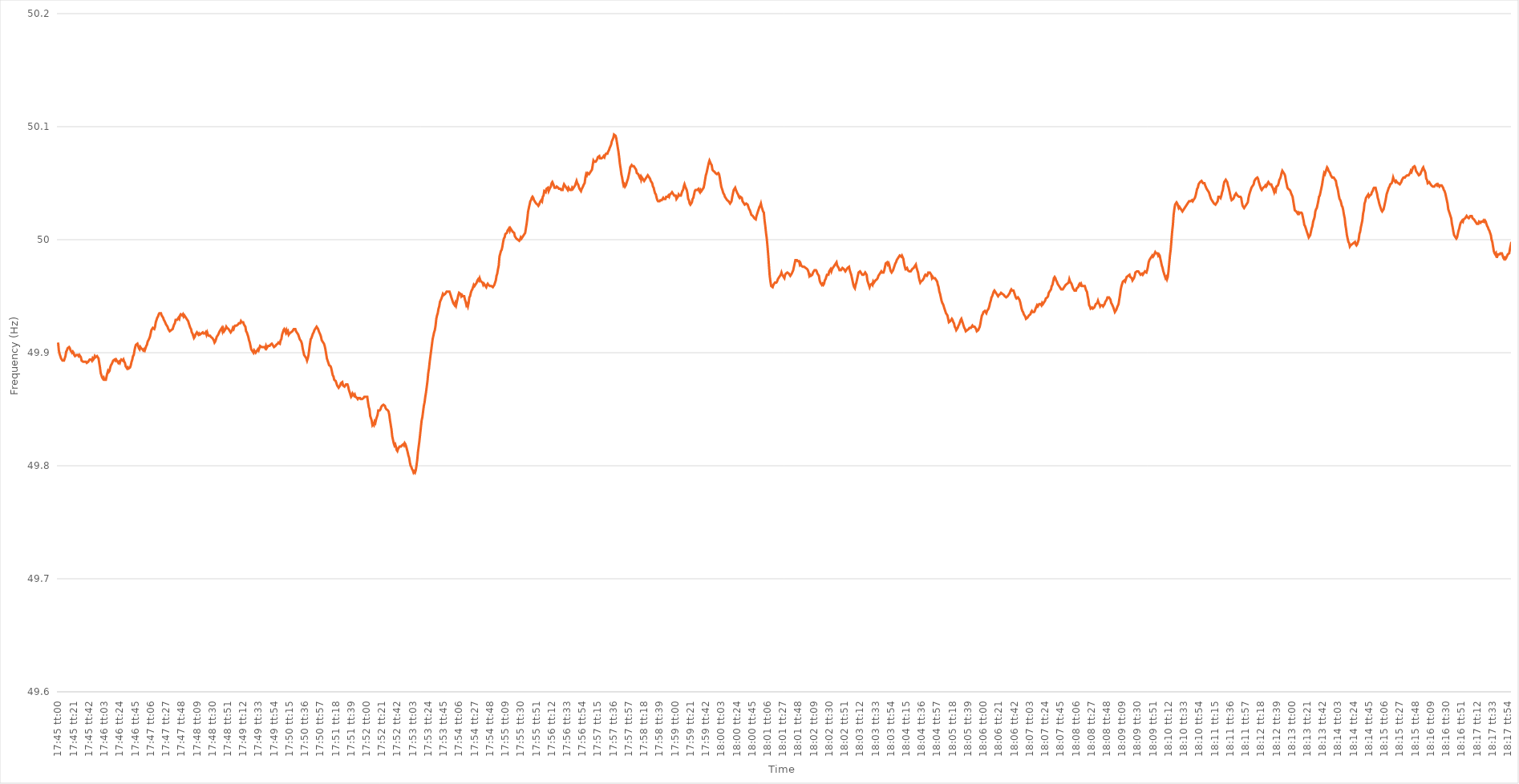
| Category | Series 0 |
|---|---|
| 0.7395833333333334 | 49.909 |
| 0.7395949074074074 | 49.902 |
| 0.7396064814814814 | 49.899 |
| 0.7396180555555555 | 49.897 |
| 0.7396296296296296 | 49.895 |
| 0.7396412037037038 | 49.894 |
| 0.7396527777777777 | 49.893 |
| 0.7396643518518519 | 49.893 |
| 0.7396759259259259 | 49.893 |
| 0.7396875 | 49.895 |
| 0.739699074074074 | 49.897 |
| 0.7397106481481481 | 49.901 |
| 0.7397222222222223 | 49.902 |
| 0.7397337962962963 | 49.904 |
| 0.7397453703703704 | 49.904 |
| 0.7397569444444444 | 49.905 |
| 0.7397685185185185 | 49.904 |
| 0.7397800925925927 | 49.902 |
| 0.7397916666666666 | 49.901 |
| 0.7398032407407408 | 49.9 |
| 0.7398148148148148 | 49.901 |
| 0.739826388888889 | 49.9 |
| 0.7398379629629629 | 49.898 |
| 0.739849537037037 | 49.897 |
| 0.7398611111111112 | 49.897 |
| 0.7398726851851851 | 49.898 |
| 0.7398842592592593 | 49.898 |
| 0.7398958333333333 | 49.898 |
| 0.7399074074074075 | 49.897 |
| 0.7399189814814814 | 49.898 |
| 0.7399305555555555 | 49.898 |
| 0.7399421296296297 | 49.896 |
| 0.7399537037037037 | 49.893 |
| 0.7399652777777778 | 49.893 |
| 0.7399768518518518 | 49.892 |
| 0.739988425925926 | 49.892 |
| 0.7400000000000001 | 49.892 |
| 0.740011574074074 | 49.892 |
| 0.7400231481481482 | 49.892 |
| 0.7400347222222222 | 49.891 |
| 0.7400462962962964 | 49.891 |
| 0.7400578703703703 | 49.892 |
| 0.7400694444444444 | 49.893 |
| 0.7400810185185186 | 49.894 |
| 0.7400925925925925 | 49.894 |
| 0.7401041666666667 | 49.894 |
| 0.7401157407407407 | 49.893 |
| 0.7401273148148149 | 49.895 |
| 0.7401388888888888 | 49.894 |
| 0.7401504629629629 | 49.895 |
| 0.7401620370370371 | 49.897 |
| 0.7401736111111111 | 49.896 |
| 0.7401851851851852 | 49.896 |
| 0.7401967592592592 | 49.897 |
| 0.7402083333333334 | 49.897 |
| 0.7402199074074075 | 49.895 |
| 0.7402314814814814 | 49.891 |
| 0.7402430555555556 | 49.887 |
| 0.7402546296296296 | 49.882 |
| 0.7402662037037038 | 49.88 |
| 0.7402777777777777 | 49.878 |
| 0.7402893518518519 | 49.877 |
| 0.740300925925926 | 49.878 |
| 0.7403124999999999 | 49.876 |
| 0.7403240740740741 | 49.876 |
| 0.7403356481481481 | 49.876 |
| 0.7403472222222223 | 49.879 |
| 0.7403587962962962 | 49.882 |
| 0.7403703703703703 | 49.884 |
| 0.7403819444444445 | 49.883 |
| 0.7403935185185185 | 49.884 |
| 0.7404050925925926 | 49.887 |
| 0.7404166666666666 | 49.889 |
| 0.7404282407407408 | 49.89 |
| 0.7404398148148149 | 49.89 |
| 0.7404513888888888 | 49.893 |
| 0.740462962962963 | 49.893 |
| 0.740474537037037 | 49.894 |
| 0.7404861111111112 | 49.893 |
| 0.7404976851851851 | 49.894 |
| 0.7405092592592593 | 49.893 |
| 0.7405208333333334 | 49.892 |
| 0.7405324074074073 | 49.891 |
| 0.7405439814814815 | 49.892 |
| 0.7405555555555555 | 49.891 |
| 0.7405671296296297 | 49.893 |
| 0.7405787037037036 | 49.894 |
| 0.7405902777777778 | 49.894 |
| 0.7406018518518519 | 49.893 |
| 0.7406134259259259 | 49.894 |
| 0.740625 | 49.892 |
| 0.740636574074074 | 49.891 |
| 0.7406481481481482 | 49.888 |
| 0.7406597222222223 | 49.887 |
| 0.7406712962962962 | 49.886 |
| 0.7406828703703704 | 49.887 |
| 0.7406944444444444 | 49.886 |
| 0.7407060185185186 | 49.886 |
| 0.7407175925925925 | 49.887 |
| 0.7407291666666667 | 49.889 |
| 0.7407407407407408 | 49.892 |
| 0.7407523148148147 | 49.894 |
| 0.7407638888888889 | 49.897 |
| 0.7407754629629629 | 49.898 |
| 0.7407870370370371 | 49.902 |
| 0.740798611111111 | 49.905 |
| 0.7408101851851852 | 49.907 |
| 0.7408217592592593 | 49.907 |
| 0.7408333333333333 | 49.908 |
| 0.7408449074074074 | 49.906 |
| 0.7408564814814814 | 49.904 |
| 0.7408680555555556 | 49.903 |
| 0.7408796296296297 | 49.905 |
| 0.7408912037037036 | 49.904 |
| 0.7409027777777778 | 49.904 |
| 0.7409143518518518 | 49.903 |
| 0.740925925925926 | 49.902 |
| 0.7409374999999999 | 49.903 |
| 0.7409490740740741 | 49.902 |
| 0.7409606481481482 | 49.904 |
| 0.7409722222222223 | 49.906 |
| 0.7409837962962963 | 49.907 |
| 0.7409953703703703 | 49.91 |
| 0.7410069444444445 | 49.911 |
| 0.7410185185185186 | 49.911 |
| 0.7410300925925926 | 49.914 |
| 0.7410416666666667 | 49.917 |
| 0.7410532407407407 | 49.92 |
| 0.7410648148148148 | 49.921 |
| 0.7410763888888888 | 49.922 |
| 0.741087962962963 | 49.922 |
| 0.7410995370370371 | 49.921 |
| 0.741111111111111 | 49.923 |
| 0.7411226851851852 | 49.927 |
| 0.7411342592592592 | 49.929 |
| 0.7411458333333334 | 49.931 |
| 0.7411574074074073 | 49.932 |
| 0.7411689814814815 | 49.934 |
| 0.7411805555555556 | 49.935 |
| 0.7411921296296297 | 49.935 |
| 0.7412037037037037 | 49.935 |
| 0.7412152777777777 | 49.933 |
| 0.7412268518518519 | 49.932 |
| 0.741238425925926 | 49.931 |
| 0.74125 | 49.929 |
| 0.7412615740740741 | 49.928 |
| 0.7412731481481482 | 49.928 |
| 0.7412847222222222 | 49.925 |
| 0.7412962962962962 | 49.925 |
| 0.7413078703703704 | 49.923 |
| 0.7413194444444445 | 49.921 |
| 0.7413310185185185 | 49.921 |
| 0.7413425925925926 | 49.919 |
| 0.7413541666666666 | 49.919 |
| 0.7413657407407408 | 49.92 |
| 0.7413773148148147 | 49.92 |
| 0.7413888888888889 | 49.921 |
| 0.741400462962963 | 49.923 |
| 0.7414120370370371 | 49.925 |
| 0.7414236111111111 | 49.926 |
| 0.7414351851851851 | 49.929 |
| 0.7414467592592593 | 49.929 |
| 0.7414583333333334 | 49.929 |
| 0.7414699074074074 | 49.93 |
| 0.7414814814814815 | 49.931 |
| 0.7414930555555556 | 49.93 |
| 0.7415046296296296 | 49.933 |
| 0.7415162037037036 | 49.934 |
| 0.7415277777777778 | 49.934 |
| 0.7415393518518519 | 49.933 |
| 0.7415509259259259 | 49.934 |
| 0.7415625 | 49.932 |
| 0.741574074074074 | 49.933 |
| 0.7415856481481482 | 49.932 |
| 0.7415972222222221 | 49.931 |
| 0.7416087962962963 | 49.93 |
| 0.7416203703703704 | 49.93 |
| 0.7416319444444445 | 49.928 |
| 0.7416435185185185 | 49.926 |
| 0.7416550925925925 | 49.924 |
| 0.7416666666666667 | 49.922 |
| 0.7416782407407408 | 49.921 |
| 0.7416898148148148 | 49.918 |
| 0.7417013888888889 | 49.917 |
| 0.741712962962963 | 49.915 |
| 0.741724537037037 | 49.913 |
| 0.741736111111111 | 49.914 |
| 0.7417476851851852 | 49.916 |
| 0.7417592592592593 | 49.916 |
| 0.7417708333333333 | 49.918 |
| 0.7417824074074074 | 49.917 |
| 0.7417939814814815 | 49.916 |
| 0.7418055555555556 | 49.917 |
| 0.7418171296296295 | 49.916 |
| 0.7418287037037037 | 49.916 |
| 0.7418402777777778 | 49.917 |
| 0.7418518518518519 | 49.917 |
| 0.7418634259259259 | 49.918 |
| 0.741875 | 49.917 |
| 0.7418865740740741 | 49.917 |
| 0.7418981481481483 | 49.917 |
| 0.7419097222222222 | 49.918 |
| 0.7419212962962963 | 49.916 |
| 0.7419328703703704 | 49.918 |
| 0.7419444444444444 | 49.916 |
| 0.7419560185185184 | 49.915 |
| 0.7419675925925926 | 49.915 |
| 0.7419791666666667 | 49.915 |
| 0.7419907407407407 | 49.914 |
| 0.7420023148148148 | 49.914 |
| 0.7420138888888889 | 49.913 |
| 0.742025462962963 | 49.912 |
| 0.7420370370370369 | 49.911 |
| 0.7420486111111111 | 49.909 |
| 0.7420601851851852 | 49.91 |
| 0.7420717592592593 | 49.912 |
| 0.7420833333333333 | 49.914 |
| 0.7420949074074074 | 49.914 |
| 0.7421064814814815 | 49.916 |
| 0.7421180555555557 | 49.916 |
| 0.7421296296296296 | 49.919 |
| 0.7421412037037037 | 49.92 |
| 0.7421527777777778 | 49.921 |
| 0.7421643518518519 | 49.922 |
| 0.7421759259259259 | 49.919 |
| 0.7421875 | 49.921 |
| 0.7421990740740741 | 49.919 |
| 0.7422106481481481 | 49.92 |
| 0.7422222222222222 | 49.921 |
| 0.7422337962962963 | 49.923 |
| 0.7422453703703704 | 49.922 |
| 0.7422569444444443 | 49.922 |
| 0.7422685185185185 | 49.921 |
| 0.7422800925925926 | 49.92 |
| 0.7422916666666667 | 49.92 |
| 0.7423032407407407 | 49.918 |
| 0.7423148148148148 | 49.919 |
| 0.7423263888888889 | 49.92 |
| 0.7423379629629631 | 49.922 |
| 0.742349537037037 | 49.921 |
| 0.7423611111111111 | 49.923 |
| 0.7423726851851852 | 49.924 |
| 0.7423842592592593 | 49.924 |
| 0.7423958333333333 | 49.924 |
| 0.7424074074074074 | 49.924 |
| 0.7424189814814816 | 49.925 |
| 0.7424305555555556 | 49.926 |
| 0.7424421296296296 | 49.926 |
| 0.7424537037037037 | 49.926 |
| 0.7424652777777778 | 49.928 |
| 0.7424768518518517 | 49.927 |
| 0.7424884259259259 | 49.927 |
| 0.7425 | 49.927 |
| 0.7425115740740741 | 49.925 |
| 0.7425231481481481 | 49.924 |
| 0.7425347222222222 | 49.923 |
| 0.7425462962962963 | 49.919 |
| 0.7425578703703705 | 49.918 |
| 0.7425694444444444 | 49.916 |
| 0.7425810185185185 | 49.914 |
| 0.7425925925925926 | 49.911 |
| 0.7426041666666667 | 49.909 |
| 0.7426157407407407 | 49.906 |
| 0.7426273148148148 | 49.903 |
| 0.742638888888889 | 49.903 |
| 0.742650462962963 | 49.901 |
| 0.742662037037037 | 49.9 |
| 0.7426736111111111 | 49.902 |
| 0.7426851851851852 | 49.901 |
| 0.7426967592592592 | 49.9 |
| 0.7427083333333333 | 49.9 |
| 0.7427199074074075 | 49.902 |
| 0.7427314814814815 | 49.903 |
| 0.7427430555555555 | 49.902 |
| 0.7427546296296296 | 49.904 |
| 0.7427662037037037 | 49.906 |
| 0.7427777777777779 | 49.906 |
| 0.7427893518518518 | 49.905 |
| 0.742800925925926 | 49.905 |
| 0.7428125 | 49.905 |
| 0.7428240740740741 | 49.905 |
| 0.7428356481481481 | 49.905 |
| 0.7428472222222222 | 49.904 |
| 0.7428587962962964 | 49.906 |
| 0.7428703703703704 | 49.904 |
| 0.7428819444444444 | 49.905 |
| 0.7428935185185185 | 49.906 |
| 0.7429050925925926 | 49.906 |
| 0.7429166666666666 | 49.906 |
| 0.7429282407407407 | 49.907 |
| 0.7429398148148149 | 49.907 |
| 0.7429513888888889 | 49.908 |
| 0.7429629629629629 | 49.907 |
| 0.742974537037037 | 49.906 |
| 0.7429861111111111 | 49.905 |
| 0.7429976851851853 | 49.905 |
| 0.7430092592592592 | 49.906 |
| 0.7430208333333334 | 49.907 |
| 0.7430324074074074 | 49.907 |
| 0.7430439814814815 | 49.908 |
| 0.7430555555555555 | 49.909 |
| 0.7430671296296296 | 49.909 |
| 0.7430787037037038 | 49.908 |
| 0.7430902777777778 | 49.911 |
| 0.7431018518518518 | 49.912 |
| 0.7431134259259259 | 49.916 |
| 0.743125 | 49.918 |
| 0.743136574074074 | 49.92 |
| 0.7431481481481481 | 49.921 |
| 0.7431597222222223 | 49.92 |
| 0.7431712962962963 | 49.918 |
| 0.7431828703703703 | 49.92 |
| 0.7431944444444444 | 49.918 |
| 0.7432060185185185 | 49.919 |
| 0.7432175925925927 | 49.916 |
| 0.7432291666666666 | 49.917 |
| 0.7432407407407408 | 49.917 |
| 0.7432523148148148 | 49.918 |
| 0.743263888888889 | 49.918 |
| 0.7432754629629629 | 49.919 |
| 0.743287037037037 | 49.919 |
| 0.7432986111111112 | 49.921 |
| 0.7433101851851852 | 49.921 |
| 0.7433217592592593 | 49.921 |
| 0.7433333333333333 | 49.919 |
| 0.7433449074074074 | 49.919 |
| 0.7433564814814814 | 49.917 |
| 0.7433680555555555 | 49.916 |
| 0.7433796296296297 | 49.914 |
| 0.7433912037037037 | 49.912 |
| 0.7434027777777777 | 49.912 |
| 0.7434143518518518 | 49.91 |
| 0.7434259259259259 | 49.908 |
| 0.7434375000000001 | 49.904 |
| 0.743449074074074 | 49.901 |
| 0.7434606481481482 | 49.898 |
| 0.7434722222222222 | 49.897 |
| 0.7434837962962964 | 49.896 |
| 0.7434953703703703 | 49.895 |
| 0.7435069444444444 | 49.893 |
| 0.7435185185185186 | 49.895 |
| 0.7435300925925926 | 49.898 |
| 0.7435416666666667 | 49.903 |
| 0.7435532407407407 | 49.908 |
| 0.7435648148148148 | 49.912 |
| 0.743576388888889 | 49.913 |
| 0.7435879629629629 | 49.915 |
| 0.7435995370370371 | 49.917 |
| 0.7436111111111111 | 49.918 |
| 0.7436226851851853 | 49.92 |
| 0.7436342592592592 | 49.921 |
| 0.7436458333333333 | 49.922 |
| 0.7436574074074075 | 49.923 |
| 0.7436689814814814 | 49.922 |
| 0.7436805555555556 | 49.921 |
| 0.7436921296296296 | 49.919 |
| 0.7437037037037038 | 49.919 |
| 0.7437152777777777 | 49.916 |
| 0.7437268518518518 | 49.914 |
| 0.743738425925926 | 49.911 |
| 0.74375 | 49.91 |
| 0.7437615740740741 | 49.909 |
| 0.7437731481481481 | 49.908 |
| 0.7437847222222222 | 49.906 |
| 0.7437962962962964 | 49.903 |
| 0.7438078703703703 | 49.899 |
| 0.7438194444444445 | 49.895 |
| 0.7438310185185185 | 49.893 |
| 0.7438425925925927 | 49.891 |
| 0.7438541666666666 | 49.889 |
| 0.7438657407407407 | 49.889 |
| 0.7438773148148149 | 49.888 |
| 0.7438888888888888 | 49.886 |
| 0.743900462962963 | 49.883 |
| 0.743912037037037 | 49.88 |
| 0.7439236111111112 | 49.879 |
| 0.7439351851851851 | 49.876 |
| 0.7439467592592592 | 49.876 |
| 0.7439583333333334 | 49.875 |
| 0.7439699074074074 | 49.875 |
| 0.7439814814814815 | 49.871 |
| 0.7439930555555555 | 49.87 |
| 0.7440046296296297 | 49.869 |
| 0.7440162037037038 | 49.869 |
| 0.7440277777777777 | 49.871 |
| 0.7440393518518519 | 49.873 |
| 0.7440509259259259 | 49.873 |
| 0.7440625000000001 | 49.874 |
| 0.744074074074074 | 49.871 |
| 0.7440856481481481 | 49.871 |
| 0.7440972222222223 | 49.87 |
| 0.7441087962962962 | 49.871 |
| 0.7441203703703704 | 49.872 |
| 0.7441319444444444 | 49.872 |
| 0.7441435185185186 | 49.872 |
| 0.7441550925925925 | 49.87 |
| 0.7441666666666666 | 49.867 |
| 0.7441782407407408 | 49.865 |
| 0.7441898148148148 | 49.863 |
| 0.7442013888888889 | 49.861 |
| 0.7442129629629629 | 49.862 |
| 0.7442245370370371 | 49.864 |
| 0.7442361111111112 | 49.864 |
| 0.7442476851851851 | 49.862 |
| 0.7442592592592593 | 49.863 |
| 0.7442708333333333 | 49.861 |
| 0.7442824074074075 | 49.861 |
| 0.7442939814814814 | 49.86 |
| 0.7443055555555556 | 49.859 |
| 0.7443171296296297 | 49.86 |
| 0.7443287037037036 | 49.86 |
| 0.7443402777777778 | 49.86 |
| 0.7443518518518518 | 49.859 |
| 0.744363425925926 | 49.859 |
| 0.7443749999999999 | 49.859 |
| 0.744386574074074 | 49.859 |
| 0.7443981481481482 | 49.86 |
| 0.7444097222222222 | 49.861 |
| 0.7444212962962963 | 49.861 |
| 0.7444328703703703 | 49.861 |
| 0.7444444444444445 | 49.861 |
| 0.7444560185185186 | 49.861 |
| 0.7444675925925925 | 49.856 |
| 0.7444791666666667 | 49.852 |
| 0.7444907407407407 | 49.85 |
| 0.7445023148148149 | 49.844 |
| 0.7445138888888888 | 49.842 |
| 0.744525462962963 | 49.84 |
| 0.7445370370370371 | 49.836 |
| 0.744548611111111 | 49.837 |
| 0.7445601851851852 | 49.836 |
| 0.7445717592592592 | 49.839 |
| 0.7445833333333334 | 49.838 |
| 0.7445949074074073 | 49.841 |
| 0.7446064814814815 | 49.843 |
| 0.7446180555555556 | 49.845 |
| 0.7446296296296296 | 49.849 |
| 0.7446412037037037 | 49.849 |
| 0.7446527777777777 | 49.849 |
| 0.7446643518518519 | 49.85 |
| 0.744675925925926 | 49.852 |
| 0.7446875 | 49.853 |
| 0.7446990740740741 | 49.853 |
| 0.7447106481481481 | 49.854 |
| 0.7447222222222223 | 49.854 |
| 0.7447337962962962 | 49.853 |
| 0.7447453703703704 | 49.851 |
| 0.7447569444444445 | 49.85 |
| 0.7447685185185186 | 49.85 |
| 0.7447800925925926 | 49.849 |
| 0.7447916666666666 | 49.848 |
| 0.7448032407407408 | 49.845 |
| 0.7448148148148147 | 49.84 |
| 0.7448263888888889 | 49.836 |
| 0.744837962962963 | 49.832 |
| 0.744849537037037 | 49.826 |
| 0.7448611111111111 | 49.823 |
| 0.7448726851851851 | 49.82 |
| 0.7448842592592593 | 49.818 |
| 0.7448958333333334 | 49.819 |
| 0.7449074074074074 | 49.817 |
| 0.7449189814814815 | 49.814 |
| 0.7449305555555555 | 49.813 |
| 0.7449421296296297 | 49.815 |
| 0.7449537037037036 | 49.815 |
| 0.7449652777777778 | 49.817 |
| 0.7449768518518519 | 49.817 |
| 0.744988425925926 | 49.817 |
| 0.745 | 49.818 |
| 0.745011574074074 | 49.818 |
| 0.7450231481481482 | 49.819 |
| 0.7450347222222223 | 49.818 |
| 0.7450462962962963 | 49.82 |
| 0.7450578703703704 | 49.819 |
| 0.7450694444444445 | 49.817 |
| 0.7450810185185185 | 49.817 |
| 0.7450925925925925 | 49.812 |
| 0.7451041666666667 | 49.809 |
| 0.7451157407407408 | 49.807 |
| 0.7451273148148148 | 49.803 |
| 0.7451388888888889 | 49.8 |
| 0.745150462962963 | 49.799 |
| 0.7451620370370371 | 49.797 |
| 0.745173611111111 | 49.796 |
| 0.7451851851851852 | 49.794 |
| 0.7451967592592593 | 49.795 |
| 0.7452083333333334 | 49.794 |
| 0.7452199074074074 | 49.796 |
| 0.7452314814814814 | 49.8 |
| 0.7452430555555556 | 49.805 |
| 0.7452546296296297 | 49.812 |
| 0.7452662037037037 | 49.817 |
| 0.7452777777777778 | 49.822 |
| 0.7452893518518519 | 49.828 |
| 0.7453009259259259 | 49.834 |
| 0.7453124999999999 | 49.84 |
| 0.7453240740740741 | 49.843 |
| 0.7453356481481482 | 49.848 |
| 0.7453472222222222 | 49.853 |
| 0.7453587962962963 | 49.856 |
| 0.7453703703703703 | 49.861 |
| 0.7453819444444445 | 49.865 |
| 0.7453935185185184 | 49.87 |
| 0.7454050925925926 | 49.875 |
| 0.7454166666666667 | 49.882 |
| 0.7454282407407408 | 49.886 |
| 0.7454398148148148 | 49.892 |
| 0.7454513888888888 | 49.897 |
| 0.745462962962963 | 49.902 |
| 0.7454745370370371 | 49.907 |
| 0.7454861111111111 | 49.912 |
| 0.7454976851851852 | 49.915 |
| 0.7455092592592593 | 49.918 |
| 0.7455208333333333 | 49.92 |
| 0.7455324074074073 | 49.924 |
| 0.7455439814814815 | 49.93 |
| 0.7455555555555556 | 49.933 |
| 0.7455671296296296 | 49.935 |
| 0.7455787037037037 | 49.939 |
| 0.7455902777777778 | 49.941 |
| 0.7456018518518519 | 49.945 |
| 0.7456134259259258 | 49.945 |
| 0.745625 | 49.948 |
| 0.7456365740740741 | 49.95 |
| 0.7456481481481482 | 49.952 |
| 0.7456597222222222 | 49.951 |
| 0.7456712962962962 | 49.951 |
| 0.7456828703703704 | 49.952 |
| 0.7456944444444445 | 49.953 |
| 0.7457060185185185 | 49.954 |
| 0.7457175925925926 | 49.954 |
| 0.7457291666666667 | 49.954 |
| 0.7457407407407407 | 49.954 |
| 0.7457523148148147 | 49.954 |
| 0.7457638888888889 | 49.952 |
| 0.745775462962963 | 49.952 |
| 0.745787037037037 | 49.948 |
| 0.7457986111111111 | 49.946 |
| 0.7458101851851852 | 49.944 |
| 0.7458217592592593 | 49.944 |
| 0.7458333333333332 | 49.942 |
| 0.7458449074074074 | 49.944 |
| 0.7458564814814815 | 49.942 |
| 0.7458680555555556 | 49.945 |
| 0.7458796296296296 | 49.948 |
| 0.7458912037037037 | 49.951 |
| 0.7459027777777778 | 49.953 |
| 0.745914351851852 | 49.953 |
| 0.7459259259259259 | 49.952 |
| 0.7459375 | 49.95 |
| 0.7459490740740741 | 49.951 |
| 0.7459606481481481 | 49.95 |
| 0.7459722222222221 | 49.95 |
| 0.7459837962962963 | 49.95 |
| 0.7459953703703704 | 49.947 |
| 0.7460069444444444 | 49.945 |
| 0.7460185185185185 | 49.942 |
| 0.7460300925925926 | 49.943 |
| 0.7460416666666667 | 49.941 |
| 0.7460532407407406 | 49.944 |
| 0.7460648148148148 | 49.949 |
| 0.7460763888888889 | 49.95 |
| 0.746087962962963 | 49.953 |
| 0.746099537037037 | 49.955 |
| 0.7461111111111111 | 49.956 |
| 0.7461226851851852 | 49.958 |
| 0.7461342592592594 | 49.96 |
| 0.7461458333333333 | 49.959 |
| 0.7461574074074074 | 49.96 |
| 0.7461689814814815 | 49.961 |
| 0.7461805555555556 | 49.962 |
| 0.7461921296296296 | 49.964 |
| 0.7462037037037037 | 49.965 |
| 0.7462152777777779 | 49.964 |
| 0.7462268518518519 | 49.966 |
| 0.7462384259259259 | 49.964 |
| 0.74625 | 49.963 |
| 0.7462615740740741 | 49.963 |
| 0.746273148148148 | 49.962 |
| 0.7462847222222222 | 49.96 |
| 0.7462962962962963 | 49.961 |
| 0.7463078703703704 | 49.96 |
| 0.7463194444444444 | 49.96 |
| 0.7463310185185185 | 49.958 |
| 0.7463425925925926 | 49.96 |
| 0.7463541666666668 | 49.961 |
| 0.7463657407407407 | 49.96 |
| 0.7463773148148148 | 49.96 |
| 0.7463888888888889 | 49.959 |
| 0.746400462962963 | 49.959 |
| 0.746412037037037 | 49.959 |
| 0.7464236111111111 | 49.959 |
| 0.7464351851851853 | 49.958 |
| 0.7464467592592593 | 49.959 |
| 0.7464583333333333 | 49.96 |
| 0.7464699074074074 | 49.962 |
| 0.7464814814814815 | 49.964 |
| 0.7464930555555555 | 49.968 |
| 0.7465046296296296 | 49.97 |
| 0.7465162037037038 | 49.974 |
| 0.7465277777777778 | 49.977 |
| 0.7465393518518518 | 49.985 |
| 0.7465509259259259 | 49.985 |
| 0.7465625 | 49.99 |
| 0.7465740740740742 | 49.991 |
| 0.7465856481481481 | 49.994 |
| 0.7465972222222222 | 49.998 |
| 0.7466087962962963 | 50.001 |
| 0.7466203703703704 | 50.002 |
| 0.7466319444444444 | 50.005 |
| 0.7466435185185185 | 50.005 |
| 0.7466550925925927 | 50.006 |
| 0.7466666666666667 | 50.008 |
| 0.7466782407407407 | 50.009 |
| 0.7466898148148148 | 50.01 |
| 0.7467013888888889 | 50.008 |
| 0.7467129629629629 | 50.01 |
| 0.746724537037037 | 50.01 |
| 0.7467361111111112 | 50.008 |
| 0.7467476851851852 | 50.007 |
| 0.7467592592592592 | 50.007 |
| 0.7467708333333333 | 50.006 |
| 0.7467824074074074 | 50.003 |
| 0.7467939814814816 | 50.003 |
| 0.7468055555555555 | 50.001 |
| 0.7468171296296297 | 50.001 |
| 0.7468287037037037 | 50 |
| 0.7468402777777778 | 50 |
| 0.7468518518518518 | 49.999 |
| 0.7468634259259259 | 50 |
| 0.7468750000000001 | 50.002 |
| 0.7468865740740741 | 50.001 |
| 0.7468981481481481 | 50.002 |
| 0.7469097222222222 | 50.002 |
| 0.7469212962962963 | 50.004 |
| 0.7469328703703703 | 50.004 |
| 0.7469444444444444 | 50.006 |
| 0.7469560185185186 | 50.01 |
| 0.7469675925925926 | 50.014 |
| 0.7469791666666666 | 50.019 |
| 0.7469907407407407 | 50.025 |
| 0.7470023148148148 | 50.028 |
| 0.747013888888889 | 50.031 |
| 0.7470254629629629 | 50.034 |
| 0.747037037037037 | 50.035 |
| 0.7470486111111111 | 50.037 |
| 0.7470601851851852 | 50.038 |
| 0.7470717592592592 | 50.037 |
| 0.7470833333333333 | 50.035 |
| 0.7470949074074075 | 50.034 |
| 0.7471064814814815 | 50.033 |
| 0.7471180555555555 | 50.032 |
| 0.7471296296296296 | 50.032 |
| 0.7471412037037037 | 50.031 |
| 0.7471527777777777 | 50.03 |
| 0.7471643518518518 | 50.031 |
| 0.747175925925926 | 50.033 |
| 0.7471875 | 50.033 |
| 0.747199074074074 | 50.035 |
| 0.7472106481481481 | 50.034 |
| 0.7472222222222222 | 50.038 |
| 0.7472337962962964 | 50.039 |
| 0.7472453703703703 | 50.043 |
| 0.7472569444444445 | 50.043 |
| 0.7472685185185185 | 50.042 |
| 0.7472800925925926 | 50.045 |
| 0.7472916666666666 | 50.045 |
| 0.7473032407407407 | 50.046 |
| 0.7473148148148149 | 50.043 |
| 0.7473263888888889 | 50.043 |
| 0.747337962962963 | 50.046 |
| 0.747349537037037 | 50.047 |
| 0.7473611111111111 | 50.05 |
| 0.7473726851851853 | 50.051 |
| 0.7473842592592592 | 50.051 |
| 0.7473958333333334 | 50.048 |
| 0.7474074074074074 | 50.046 |
| 0.7474189814814814 | 50.046 |
| 0.7474305555555555 | 50.046 |
| 0.7474421296296296 | 50.047 |
| 0.7474537037037038 | 50.047 |
| 0.7474652777777777 | 50.046 |
| 0.7474768518518519 | 50.045 |
| 0.7474884259259259 | 50.045 |
| 0.7475 | 50.045 |
| 0.747511574074074 | 50.044 |
| 0.7475231481481481 | 50.044 |
| 0.7475347222222223 | 50.044 |
| 0.7475462962962963 | 50.047 |
| 0.7475578703703704 | 50.049 |
| 0.7475694444444444 | 50.048 |
| 0.7475810185185185 | 50.048 |
| 0.7475925925925927 | 50.046 |
| 0.7476041666666666 | 50.045 |
| 0.7476157407407408 | 50.044 |
| 0.7476273148148148 | 50.046 |
| 0.747638888888889 | 50.045 |
| 0.7476504629629629 | 50.044 |
| 0.747662037037037 | 50.044 |
| 0.7476736111111112 | 50.044 |
| 0.7476851851851851 | 50.046 |
| 0.7476967592592593 | 50.045 |
| 0.7477083333333333 | 50.046 |
| 0.7477199074074075 | 50.046 |
| 0.7477314814814814 | 50.048 |
| 0.7477430555555555 | 50.05 |
| 0.7477546296296297 | 50.052 |
| 0.7477662037037037 | 50.05 |
| 0.7477777777777778 | 50.049 |
| 0.7477893518518518 | 50.047 |
| 0.747800925925926 | 50.045 |
| 0.7478125000000001 | 50.045 |
| 0.747824074074074 | 50.043 |
| 0.7478356481481482 | 50.045 |
| 0.7478472222222222 | 50.046 |
| 0.7478587962962964 | 50.046 |
| 0.7478703703703703 | 50.049 |
| 0.7478819444444444 | 50.05 |
| 0.7478935185185186 | 50.055 |
| 0.7479050925925925 | 50.058 |
| 0.7479166666666667 | 50.057 |
| 0.7479282407407407 | 50.059 |
| 0.7479398148148149 | 50.059 |
| 0.7479513888888888 | 50.058 |
| 0.7479629629629629 | 50.059 |
| 0.7479745370370371 | 50.059 |
| 0.7479861111111111 | 50.061 |
| 0.7479976851851852 | 50.062 |
| 0.7480092592592592 | 50.066 |
| 0.7480208333333334 | 50.07 |
| 0.7480324074074075 | 50.069 |
| 0.7480439814814814 | 50.069 |
| 0.7480555555555556 | 50.069 |
| 0.7480671296296296 | 50.07 |
| 0.7480787037037038 | 50.071 |
| 0.7480902777777777 | 50.073 |
| 0.7481018518518519 | 50.073 |
| 0.748113425925926 | 50.074 |
| 0.7481249999999999 | 50.072 |
| 0.7481365740740741 | 50.072 |
| 0.7481481481481481 | 50.072 |
| 0.7481597222222223 | 50.072 |
| 0.7481712962962962 | 50.073 |
| 0.7481828703703703 | 50.074 |
| 0.7481944444444445 | 50.073 |
| 0.7482060185185185 | 50.075 |
| 0.7482175925925926 | 50.076 |
| 0.7482291666666666 | 50.076 |
| 0.7482407407407408 | 50.076 |
| 0.7482523148148149 | 50.078 |
| 0.7482638888888888 | 50.079 |
| 0.748275462962963 | 50.081 |
| 0.748287037037037 | 50.081 |
| 0.7482986111111112 | 50.084 |
| 0.7483101851851851 | 50.087 |
| 0.7483217592592593 | 50.087 |
| 0.7483333333333334 | 50.09 |
| 0.7483449074074073 | 50.093 |
| 0.7483564814814815 | 50.093 |
| 0.7483680555555555 | 50.092 |
| 0.7483796296296297 | 50.09 |
| 0.7483912037037036 | 50.086 |
| 0.7484027777777778 | 50.082 |
| 0.7484143518518519 | 50.078 |
| 0.7484259259259259 | 50.073 |
| 0.7484375 | 50.067 |
| 0.748449074074074 | 50.063 |
| 0.7484606481481482 | 50.058 |
| 0.7484722222222223 | 50.055 |
| 0.7484837962962962 | 50.051 |
| 0.7484953703703704 | 50.048 |
| 0.7485069444444444 | 50.049 |
| 0.7485185185185186 | 50.047 |
| 0.7485300925925925 | 50.048 |
| 0.7485416666666667 | 50.05 |
| 0.7485532407407408 | 50.052 |
| 0.7485648148148147 | 50.054 |
| 0.7485763888888889 | 50.057 |
| 0.7485879629629629 | 50.06 |
| 0.7485995370370371 | 50.064 |
| 0.748611111111111 | 50.064 |
| 0.7486226851851852 | 50.066 |
| 0.7486342592592593 | 50.065 |
| 0.7486458333333333 | 50.065 |
| 0.7486574074074074 | 50.065 |
| 0.7486689814814814 | 50.064 |
| 0.7486805555555556 | 50.063 |
| 0.7486921296296297 | 50.062 |
| 0.7487037037037036 | 50.059 |
| 0.7487152777777778 | 50.059 |
| 0.7487268518518518 | 50.058 |
| 0.748738425925926 | 50.058 |
| 0.7487499999999999 | 50.055 |
| 0.7487615740740741 | 50.056 |
| 0.7487731481481482 | 50.053 |
| 0.7487847222222223 | 50.055 |
| 0.7487962962962963 | 50.054 |
| 0.7488078703703703 | 50.053 |
| 0.7488194444444445 | 50.052 |
| 0.7488310185185186 | 50.053 |
| 0.7488425925925926 | 50.053 |
| 0.7488541666666667 | 50.055 |
| 0.7488657407407407 | 50.056 |
| 0.7488773148148148 | 50.057 |
| 0.7488888888888888 | 50.056 |
| 0.748900462962963 | 50.056 |
| 0.7489120370370371 | 50.054 |
| 0.748923611111111 | 50.052 |
| 0.7489351851851852 | 50.051 |
| 0.7489467592592592 | 50.05 |
| 0.7489583333333334 | 50.047 |
| 0.7489699074074073 | 50.046 |
| 0.7489814814814815 | 50.043 |
| 0.7489930555555556 | 50.041 |
| 0.7490046296296297 | 50.04 |
| 0.7490162037037037 | 50.037 |
| 0.7490277777777777 | 50.035 |
| 0.7490393518518519 | 50.034 |
| 0.749050925925926 | 50.034 |
| 0.7490625 | 50.034 |
| 0.7490740740740741 | 50.035 |
| 0.7490856481481482 | 50.035 |
| 0.7490972222222222 | 50.035 |
| 0.7491087962962962 | 50.036 |
| 0.7491203703703704 | 50.037 |
| 0.7491319444444445 | 50.036 |
| 0.7491435185185185 | 50.036 |
| 0.7491550925925926 | 50.036 |
| 0.7491666666666666 | 50.038 |
| 0.7491782407407408 | 50.038 |
| 0.7491898148148147 | 50.038 |
| 0.7492013888888889 | 50.039 |
| 0.749212962962963 | 50.038 |
| 0.7492245370370371 | 50.04 |
| 0.7492361111111111 | 50.04 |
| 0.7492476851851851 | 50.041 |
| 0.7492592592592593 | 50.042 |
| 0.7492708333333334 | 50.042 |
| 0.7492824074074074 | 50.04 |
| 0.7492939814814815 | 50.039 |
| 0.7493055555555556 | 50.039 |
| 0.7493171296296296 | 50.039 |
| 0.7493287037037036 | 50.036 |
| 0.7493402777777778 | 50.037 |
| 0.7493518518518519 | 50.038 |
| 0.7493634259259259 | 50.04 |
| 0.749375 | 50.039 |
| 0.749386574074074 | 50.039 |
| 0.7493981481481482 | 50.039 |
| 0.7494097222222221 | 50.041 |
| 0.7494212962962963 | 50.043 |
| 0.7494328703703704 | 50.044 |
| 0.7494444444444445 | 50.047 |
| 0.7494560185185185 | 50.049 |
| 0.7494675925925925 | 50.047 |
| 0.7494791666666667 | 50.047 |
| 0.7494907407407408 | 50.044 |
| 0.7495023148148148 | 50.041 |
| 0.7495138888888889 | 50.036 |
| 0.749525462962963 | 50.035 |
| 0.749537037037037 | 50.032 |
| 0.749548611111111 | 50.031 |
| 0.7495601851851852 | 50.032 |
| 0.7495717592592593 | 50.033 |
| 0.7495833333333333 | 50.036 |
| 0.7495949074074074 | 50.037 |
| 0.7496064814814815 | 50.04 |
| 0.7496180555555556 | 50.043 |
| 0.7496296296296295 | 50.044 |
| 0.7496412037037037 | 50.044 |
| 0.7496527777777778 | 50.044 |
| 0.7496643518518519 | 50.044 |
| 0.7496759259259259 | 50.045 |
| 0.7496875 | 50.043 |
| 0.7496990740740741 | 50.042 |
| 0.7497106481481483 | 50.044 |
| 0.7497222222222222 | 50.043 |
| 0.7497337962962963 | 50.043 |
| 0.7497453703703704 | 50.045 |
| 0.7497569444444444 | 50.046 |
| 0.7497685185185184 | 50.049 |
| 0.7497800925925926 | 50.053 |
| 0.7497916666666667 | 50.057 |
| 0.7498032407407407 | 50.059 |
| 0.7498148148148148 | 50.062 |
| 0.7498263888888889 | 50.065 |
| 0.749837962962963 | 50.068 |
| 0.7498495370370369 | 50.07 |
| 0.7498611111111111 | 50.07 |
| 0.7498726851851852 | 50.067 |
| 0.7498842592592593 | 50.066 |
| 0.7498958333333333 | 50.062 |
| 0.7499074074074074 | 50.061 |
| 0.7499189814814815 | 50.061 |
| 0.7499305555555557 | 50.06 |
| 0.7499421296296296 | 50.059 |
| 0.7499537037037037 | 50.059 |
| 0.7499652777777778 | 50.058 |
| 0.7499768518518519 | 50.058 |
| 0.7499884259259259 | 50.059 |
| 0.75 | 50.058 |
| 0.7500115740740741 | 50.055 |
| 0.7500231481481481 | 50.051 |
| 0.7500347222222222 | 50.047 |
| 0.7500462962962963 | 50.045 |
| 0.7500578703703704 | 50.043 |
| 0.7500694444444443 | 50.041 |
| 0.7500810185185185 | 50.04 |
| 0.7500925925925926 | 50.038 |
| 0.7501041666666667 | 50.038 |
| 0.7501157407407407 | 50.036 |
| 0.7501273148148148 | 50.035 |
| 0.7501388888888889 | 50.035 |
| 0.7501504629629631 | 50.034 |
| 0.750162037037037 | 50.034 |
| 0.7501736111111111 | 50.032 |
| 0.7501851851851852 | 50.033 |
| 0.7501967592592593 | 50.034 |
| 0.7502083333333333 | 50.038 |
| 0.7502199074074074 | 50.041 |
| 0.7502314814814816 | 50.044 |
| 0.7502430555555555 | 50.044 |
| 0.7502546296296296 | 50.046 |
| 0.7502662037037037 | 50.044 |
| 0.7502777777777778 | 50.044 |
| 0.7502893518518517 | 50.041 |
| 0.7503009259259259 | 50.04 |
| 0.7503125 | 50.038 |
| 0.7503240740740741 | 50.037 |
| 0.7503356481481481 | 50.038 |
| 0.7503472222222222 | 50.038 |
| 0.7503587962962963 | 50.037 |
| 0.7503703703703705 | 50.034 |
| 0.7503819444444444 | 50.033 |
| 0.7503935185185185 | 50.032 |
| 0.7504050925925926 | 50.031 |
| 0.7504166666666667 | 50.031 |
| 0.7504282407407407 | 50.032 |
| 0.7504398148148148 | 50.032 |
| 0.750451388888889 | 50.031 |
| 0.750462962962963 | 50.031 |
| 0.750474537037037 | 50.027 |
| 0.7504861111111111 | 50.026 |
| 0.7504976851851852 | 50.024 |
| 0.7505092592592592 | 50.022 |
| 0.7505208333333333 | 50.022 |
| 0.7505324074074075 | 50.021 |
| 0.7505439814814815 | 50.02 |
| 0.7505555555555555 | 50.019 |
| 0.7505671296296296 | 50.019 |
| 0.7505787037037037 | 50.018 |
| 0.7505902777777779 | 50.021 |
| 0.7506018518518518 | 50.021 |
| 0.750613425925926 | 50.025 |
| 0.750625 | 50.027 |
| 0.7506365740740741 | 50.029 |
| 0.7506481481481481 | 50.03 |
| 0.7506597222222222 | 50.032 |
| 0.7506712962962964 | 50.029 |
| 0.7506828703703704 | 50.027 |
| 0.7506944444444444 | 50.025 |
| 0.7507060185185185 | 50.024 |
| 0.7507175925925926 | 50.017 |
| 0.7507291666666666 | 50.012 |
| 0.7507407407407407 | 50.006 |
| 0.7507523148148149 | 50.001 |
| 0.7507638888888889 | 49.994 |
| 0.7507754629629629 | 49.986 |
| 0.750787037037037 | 49.977 |
| 0.7507986111111111 | 49.968 |
| 0.7508101851851853 | 49.963 |
| 0.7508217592592592 | 49.959 |
| 0.7508333333333334 | 49.959 |
| 0.7508449074074074 | 49.958 |
| 0.7508564814814815 | 49.96 |
| 0.7508680555555555 | 49.961 |
| 0.7508796296296296 | 49.962 |
| 0.7508912037037038 | 49.962 |
| 0.7509027777777778 | 49.962 |
| 0.7509143518518518 | 49.963 |
| 0.7509259259259259 | 49.965 |
| 0.7509375 | 49.966 |
| 0.750949074074074 | 49.966 |
| 0.7509606481481481 | 49.968 |
| 0.7509722222222223 | 49.969 |
| 0.7509837962962963 | 49.971 |
| 0.7509953703703703 | 49.969 |
| 0.7510069444444444 | 49.968 |
| 0.7510185185185185 | 49.967 |
| 0.7510300925925927 | 49.966 |
| 0.7510416666666666 | 49.969 |
| 0.7510532407407408 | 49.97 |
| 0.7510648148148148 | 49.97 |
| 0.751076388888889 | 49.971 |
| 0.7510879629629629 | 49.971 |
| 0.751099537037037 | 49.97 |
| 0.7511111111111112 | 49.97 |
| 0.7511226851851852 | 49.968 |
| 0.7511342592592593 | 49.968 |
| 0.7511458333333333 | 49.97 |
| 0.7511574074074074 | 49.97 |
| 0.7511689814814816 | 49.973 |
| 0.7511805555555555 | 49.976 |
| 0.7511921296296297 | 49.979 |
| 0.7512037037037037 | 49.982 |
| 0.7512152777777777 | 49.982 |
| 0.7512268518518518 | 49.982 |
| 0.7512384259259259 | 49.981 |
| 0.7512500000000001 | 49.981 |
| 0.751261574074074 | 49.981 |
| 0.7512731481481482 | 49.978 |
| 0.7512847222222222 | 49.979 |
| 0.7512962962962964 | 49.977 |
| 0.7513078703703703 | 49.977 |
| 0.7513194444444444 | 49.976 |
| 0.7513310185185186 | 49.976 |
| 0.7513425925925926 | 49.976 |
| 0.7513541666666667 | 49.976 |
| 0.7513657407407407 | 49.975 |
| 0.7513773148148148 | 49.975 |
| 0.751388888888889 | 49.974 |
| 0.7514004629629629 | 49.973 |
| 0.7514120370370371 | 49.971 |
| 0.7514236111111111 | 49.968 |
| 0.7514351851851852 | 49.969 |
| 0.7514467592592592 | 49.968 |
| 0.7514583333333333 | 49.968 |
| 0.7514699074074075 | 49.969 |
| 0.7514814814814814 | 49.971 |
| 0.7514930555555556 | 49.972 |
| 0.7515046296296296 | 49.973 |
| 0.7515162037037038 | 49.973 |
| 0.7515277777777777 | 49.973 |
| 0.7515393518518518 | 49.972 |
| 0.751550925925926 | 49.97 |
| 0.7515625 | 49.97 |
| 0.7515740740740741 | 49.968 |
| 0.7515856481481481 | 49.964 |
| 0.7515972222222222 | 49.962 |
| 0.7516087962962964 | 49.961 |
| 0.7516203703703703 | 49.96 |
| 0.7516319444444445 | 49.961 |
| 0.7516435185185185 | 49.96 |
| 0.7516550925925927 | 49.961 |
| 0.7516666666666666 | 49.964 |
| 0.7516782407407407 | 49.965 |
| 0.7516898148148149 | 49.967 |
| 0.7517013888888888 | 49.969 |
| 0.751712962962963 | 49.969 |
| 0.751724537037037 | 49.969 |
| 0.7517361111111112 | 49.972 |
| 0.7517476851851851 | 49.973 |
| 0.7517592592592592 | 49.974 |
| 0.7517708333333334 | 49.972 |
| 0.7517824074074074 | 49.974 |
| 0.7517939814814815 | 49.974 |
| 0.7518055555555555 | 49.976 |
| 0.7518171296296297 | 49.976 |
| 0.7518287037037038 | 49.978 |
| 0.7518402777777777 | 49.979 |
| 0.7518518518518519 | 49.98 |
| 0.7518634259259259 | 49.977 |
| 0.7518750000000001 | 49.976 |
| 0.751886574074074 | 49.975 |
| 0.7518981481481481 | 49.973 |
| 0.7519097222222223 | 49.973 |
| 0.7519212962962962 | 49.973 |
| 0.7519328703703704 | 49.973 |
| 0.7519444444444444 | 49.975 |
| 0.7519560185185186 | 49.975 |
| 0.7519675925925925 | 49.974 |
| 0.7519791666666666 | 49.973 |
| 0.7519907407407408 | 49.972 |
| 0.7520023148148148 | 49.972 |
| 0.7520138888888889 | 49.974 |
| 0.7520254629629629 | 49.975 |
| 0.7520370370370371 | 49.975 |
| 0.7520486111111112 | 49.976 |
| 0.7520601851851851 | 49.973 |
| 0.7520717592592593 | 49.971 |
| 0.7520833333333333 | 49.969 |
| 0.7520949074074075 | 49.966 |
| 0.7521064814814814 | 49.963 |
| 0.7521180555555556 | 49.96 |
| 0.7521296296296297 | 49.958 |
| 0.7521412037037036 | 49.957 |
| 0.7521527777777778 | 49.96 |
| 0.7521643518518518 | 49.962 |
| 0.752175925925926 | 49.965 |
| 0.7521874999999999 | 49.968 |
| 0.752199074074074 | 49.971 |
| 0.7522106481481482 | 49.971 |
| 0.7522222222222222 | 49.972 |
| 0.7522337962962963 | 49.971 |
| 0.7522453703703703 | 49.97 |
| 0.7522569444444445 | 49.969 |
| 0.7522685185185186 | 49.969 |
| 0.7522800925925925 | 49.969 |
| 0.7522916666666667 | 49.97 |
| 0.7523032407407407 | 49.971 |
| 0.7523148148148149 | 49.97 |
| 0.7523263888888888 | 49.969 |
| 0.752337962962963 | 49.964 |
| 0.7523495370370371 | 49.962 |
| 0.7523611111111111 | 49.96 |
| 0.7523726851851852 | 49.958 |
| 0.7523842592592592 | 49.96 |
| 0.7523958333333334 | 49.96 |
| 0.7524074074074073 | 49.961 |
| 0.7524189814814815 | 49.96 |
| 0.7524305555555556 | 49.963 |
| 0.7524421296296296 | 49.962 |
| 0.7524537037037037 | 49.963 |
| 0.7524652777777777 | 49.964 |
| 0.7524768518518519 | 49.964 |
| 0.752488425925926 | 49.965 |
| 0.7525 | 49.966 |
| 0.7525115740740741 | 49.968 |
| 0.7525231481481481 | 49.969 |
| 0.7525347222222223 | 49.97 |
| 0.7525462962962962 | 49.971 |
| 0.7525578703703704 | 49.972 |
| 0.7525694444444445 | 49.971 |
| 0.7525810185185186 | 49.971 |
| 0.7525925925925926 | 49.971 |
| 0.7526041666666666 | 49.973 |
| 0.7526157407407408 | 49.976 |
| 0.7526273148148147 | 49.979 |
| 0.7526388888888889 | 49.979 |
| 0.752650462962963 | 49.98 |
| 0.752662037037037 | 49.978 |
| 0.7526736111111111 | 49.979 |
| 0.7526851851851851 | 49.977 |
| 0.7526967592592593 | 49.974 |
| 0.7527083333333334 | 49.972 |
| 0.7527199074074074 | 49.971 |
| 0.7527314814814815 | 49.971 |
| 0.7527430555555555 | 49.973 |
| 0.7527546296296297 | 49.973 |
| 0.7527662037037036 | 49.977 |
| 0.7527777777777778 | 49.979 |
| 0.7527893518518519 | 49.98 |
| 0.752800925925926 | 49.982 |
| 0.7528125 | 49.983 |
| 0.752824074074074 | 49.983 |
| 0.7528356481481482 | 49.985 |
| 0.7528472222222221 | 49.986 |
| 0.7528587962962963 | 49.986 |
| 0.7528703703703704 | 49.985 |
| 0.7528819444444445 | 49.986 |
| 0.7528935185185185 | 49.986 |
| 0.7529050925925925 | 49.983 |
| 0.7529166666666667 | 49.979 |
| 0.7529282407407408 | 49.976 |
| 0.7529398148148148 | 49.974 |
| 0.7529513888888889 | 49.974 |
| 0.752962962962963 | 49.975 |
| 0.7529745370370371 | 49.973 |
| 0.752986111111111 | 49.973 |
| 0.7529976851851852 | 49.972 |
| 0.7530092592592593 | 49.972 |
| 0.7530208333333334 | 49.972 |
| 0.7530324074074074 | 49.973 |
| 0.7530439814814814 | 49.974 |
| 0.7530555555555556 | 49.974 |
| 0.7530671296296297 | 49.975 |
| 0.7530787037037037 | 49.976 |
| 0.7530902777777778 | 49.977 |
| 0.7531018518518519 | 49.978 |
| 0.7531134259259259 | 49.975 |
| 0.7531249999999999 | 49.973 |
| 0.7531365740740741 | 49.971 |
| 0.7531481481481482 | 49.967 |
| 0.7531597222222222 | 49.964 |
| 0.7531712962962963 | 49.962 |
| 0.7531828703703703 | 49.963 |
| 0.7531944444444445 | 49.963 |
| 0.7532060185185184 | 49.964 |
| 0.7532175925925926 | 49.965 |
| 0.7532291666666667 | 49.966 |
| 0.7532407407407408 | 49.968 |
| 0.7532523148148148 | 49.969 |
| 0.7532638888888888 | 49.969 |
| 0.753275462962963 | 49.968 |
| 0.7532870370370371 | 49.969 |
| 0.7532986111111111 | 49.971 |
| 0.7533101851851852 | 49.971 |
| 0.7533217592592593 | 49.971 |
| 0.7533333333333333 | 49.97 |
| 0.7533449074074073 | 49.969 |
| 0.7533564814814815 | 49.966 |
| 0.7533680555555556 | 49.967 |
| 0.7533796296296296 | 49.966 |
| 0.7533912037037037 | 49.966 |
| 0.7534027777777778 | 49.966 |
| 0.7534143518518519 | 49.965 |
| 0.7534259259259258 | 49.964 |
| 0.7534375 | 49.963 |
| 0.7534490740740741 | 49.96 |
| 0.7534606481481482 | 49.958 |
| 0.7534722222222222 | 49.954 |
| 0.7534837962962962 | 49.952 |
| 0.7534953703703704 | 49.949 |
| 0.7535069444444445 | 49.946 |
| 0.7535185185185185 | 49.944 |
| 0.7535300925925926 | 49.943 |
| 0.7535416666666667 | 49.941 |
| 0.7535532407407407 | 49.939 |
| 0.7535648148148147 | 49.937 |
| 0.7535763888888889 | 49.935 |
| 0.753587962962963 | 49.934 |
| 0.753599537037037 | 49.933 |
| 0.7536111111111111 | 49.93 |
| 0.7536226851851852 | 49.927 |
| 0.7536342592592593 | 49.927 |
| 0.7536458333333332 | 49.928 |
| 0.7536574074074074 | 49.929 |
| 0.7536689814814815 | 49.93 |
| 0.7536805555555556 | 49.929 |
| 0.7536921296296296 | 49.927 |
| 0.7537037037037037 | 49.926 |
| 0.7537152777777778 | 49.923 |
| 0.753726851851852 | 49.922 |
| 0.7537384259259259 | 49.92 |
| 0.75375 | 49.921 |
| 0.7537615740740741 | 49.922 |
| 0.7537731481481482 | 49.924 |
| 0.7537847222222221 | 49.925 |
| 0.7537962962962963 | 49.927 |
| 0.7538078703703704 | 49.929 |
| 0.7538194444444444 | 49.93 |
| 0.7538310185185185 | 49.928 |
| 0.7538425925925926 | 49.926 |
| 0.7538541666666667 | 49.924 |
| 0.7538657407407406 | 49.922 |
| 0.7538773148148148 | 49.921 |
| 0.7538888888888889 | 49.919 |
| 0.753900462962963 | 49.919 |
| 0.753912037037037 | 49.92 |
| 0.7539236111111111 | 49.92 |
| 0.7539351851851852 | 49.921 |
| 0.7539467592592594 | 49.922 |
| 0.7539583333333333 | 49.922 |
| 0.7539699074074074 | 49.922 |
| 0.7539814814814815 | 49.923 |
| 0.7539930555555556 | 49.924 |
| 0.7540046296296296 | 49.923 |
| 0.7540162037037037 | 49.923 |
| 0.7540277777777779 | 49.923 |
| 0.7540393518518518 | 49.922 |
| 0.7540509259259259 | 49.921 |
| 0.7540625 | 49.919 |
| 0.7540740740740741 | 49.919 |
| 0.754085648148148 | 49.92 |
| 0.7540972222222222 | 49.92 |
| 0.7541087962962963 | 49.923 |
| 0.7541203703703704 | 49.926 |
| 0.7541319444444444 | 49.93 |
| 0.7541435185185185 | 49.933 |
| 0.7541550925925926 | 49.934 |
| 0.7541666666666668 | 49.936 |
| 0.7541782407407407 | 49.936 |
| 0.7541898148148148 | 49.937 |
| 0.7542013888888889 | 49.936 |
| 0.754212962962963 | 49.935 |
| 0.754224537037037 | 49.937 |
| 0.7542361111111111 | 49.938 |
| 0.7542476851851853 | 49.939 |
| 0.7542592592592593 | 49.941 |
| 0.7542708333333333 | 49.944 |
| 0.7542824074074074 | 49.946 |
| 0.7542939814814815 | 49.949 |
| 0.7543055555555555 | 49.95 |
| 0.7543171296296296 | 49.952 |
| 0.7543287037037038 | 49.954 |
| 0.7543402777777778 | 49.955 |
| 0.7543518518518518 | 49.954 |
| 0.7543634259259259 | 49.953 |
| 0.754375 | 49.952 |
| 0.7543865740740742 | 49.952 |
| 0.7543981481481481 | 49.95 |
| 0.7544097222222222 | 49.951 |
| 0.7544212962962963 | 49.951 |
| 0.7544328703703704 | 49.952 |
| 0.7544444444444444 | 49.953 |
| 0.7544560185185185 | 49.953 |
| 0.7544675925925927 | 49.952 |
| 0.7544791666666667 | 49.952 |
| 0.7544907407407407 | 49.951 |
| 0.7545023148148148 | 49.95 |
| 0.7545138888888889 | 49.95 |
| 0.7545254629629629 | 49.949 |
| 0.754537037037037 | 49.949 |
| 0.7545486111111112 | 49.95 |
| 0.7545601851851852 | 49.951 |
| 0.7545717592592592 | 49.951 |
| 0.7545833333333333 | 49.953 |
| 0.7545949074074074 | 49.955 |
| 0.7546064814814816 | 49.956 |
| 0.7546180555555555 | 49.955 |
| 0.7546296296296297 | 49.955 |
| 0.7546412037037037 | 49.955 |
| 0.7546527777777778 | 49.953 |
| 0.7546643518518518 | 49.951 |
| 0.7546759259259259 | 49.949 |
| 0.7546875000000001 | 49.948 |
| 0.7546990740740741 | 49.948 |
| 0.7547106481481481 | 49.949 |
| 0.7547222222222222 | 49.948 |
| 0.7547337962962963 | 49.947 |
| 0.7547453703703703 | 49.945 |
| 0.7547569444444444 | 49.942 |
| 0.7547685185185186 | 49.939 |
| 0.7547800925925926 | 49.937 |
| 0.7547916666666666 | 49.936 |
| 0.7548032407407407 | 49.934 |
| 0.7548148148148148 | 49.933 |
| 0.754826388888889 | 49.932 |
| 0.7548379629629629 | 49.93 |
| 0.754849537037037 | 49.93 |
| 0.7548611111111111 | 49.931 |
| 0.7548726851851852 | 49.931 |
| 0.7548842592592592 | 49.933 |
| 0.7548958333333333 | 49.933 |
| 0.7549074074074075 | 49.934 |
| 0.7549189814814815 | 49.936 |
| 0.7549305555555555 | 49.937 |
| 0.7549421296296296 | 49.936 |
| 0.7549537037037037 | 49.936 |
| 0.7549652777777779 | 49.936 |
| 0.7549768518518518 | 49.937 |
| 0.754988425925926 | 49.939 |
| 0.755 | 49.939 |
| 0.755011574074074 | 49.942 |
| 0.7550231481481481 | 49.941 |
| 0.7550347222222222 | 49.941 |
| 0.7550462962962964 | 49.943 |
| 0.7550578703703703 | 49.943 |
| 0.7550694444444445 | 49.943 |
| 0.7550810185185185 | 49.942 |
| 0.7550925925925926 | 49.944 |
| 0.7551041666666666 | 49.943 |
| 0.7551157407407407 | 49.944 |
| 0.7551273148148149 | 49.945 |
| 0.7551388888888889 | 49.946 |
| 0.755150462962963 | 49.948 |
| 0.755162037037037 | 49.948 |
| 0.7551736111111111 | 49.949 |
| 0.7551851851851853 | 49.95 |
| 0.7551967592592592 | 49.953 |
| 0.7552083333333334 | 49.953 |
| 0.7552199074074074 | 49.955 |
| 0.7552314814814814 | 49.956 |
| 0.7552430555555555 | 49.959 |
| 0.7552546296296296 | 49.96 |
| 0.7552662037037038 | 49.963 |
| 0.7552777777777777 | 49.966 |
| 0.7552893518518519 | 49.967 |
| 0.7553009259259259 | 49.966 |
| 0.7553125 | 49.964 |
| 0.755324074074074 | 49.963 |
| 0.7553356481481481 | 49.961 |
| 0.7553472222222223 | 49.96 |
| 0.7553587962962963 | 49.959 |
| 0.7553703703703704 | 49.959 |
| 0.7553819444444444 | 49.957 |
| 0.7553935185185185 | 49.956 |
| 0.7554050925925927 | 49.956 |
| 0.7554166666666666 | 49.956 |
| 0.7554282407407408 | 49.957 |
| 0.7554398148148148 | 49.957 |
| 0.7554513888888889 | 49.959 |
| 0.7554629629629629 | 49.96 |
| 0.755474537037037 | 49.96 |
| 0.7554861111111112 | 49.961 |
| 0.7554976851851851 | 49.961 |
| 0.7555092592592593 | 49.962 |
| 0.7555208333333333 | 49.965 |
| 0.7555324074074075 | 49.963 |
| 0.7555439814814814 | 49.963 |
| 0.7555555555555555 | 49.961 |
| 0.7555671296296297 | 49.959 |
| 0.7555787037037037 | 49.957 |
| 0.7555902777777778 | 49.957 |
| 0.7556018518518518 | 49.955 |
| 0.755613425925926 | 49.955 |
| 0.7556250000000001 | 49.955 |
| 0.755636574074074 | 49.957 |
| 0.7556481481481482 | 49.957 |
| 0.7556597222222222 | 49.958 |
| 0.7556712962962964 | 49.96 |
| 0.7556828703703703 | 49.961 |
| 0.7556944444444444 | 49.96 |
| 0.7557060185185186 | 49.961 |
| 0.7557175925925925 | 49.959 |
| 0.7557291666666667 | 49.959 |
| 0.7557407407407407 | 49.959 |
| 0.7557523148148149 | 49.959 |
| 0.7557638888888888 | 49.959 |
| 0.7557754629629629 | 49.957 |
| 0.7557870370370371 | 49.955 |
| 0.7557986111111111 | 49.954 |
| 0.7558101851851852 | 49.95 |
| 0.7558217592592592 | 49.947 |
| 0.7558333333333334 | 49.942 |
| 0.7558449074074075 | 49.941 |
| 0.7558564814814814 | 49.939 |
| 0.7558680555555556 | 49.939 |
| 0.7558796296296296 | 49.94 |
| 0.7558912037037038 | 49.939 |
| 0.7559027777777777 | 49.939 |
| 0.7559143518518519 | 49.94 |
| 0.755925925925926 | 49.94 |
| 0.7559374999999999 | 49.943 |
| 0.7559490740740741 | 49.943 |
| 0.7559606481481481 | 49.944 |
| 0.7559722222222223 | 49.946 |
| 0.7559837962962962 | 49.944 |
| 0.7559953703703703 | 49.943 |
| 0.7560069444444445 | 49.941 |
| 0.7560185185185185 | 49.942 |
| 0.7560300925925926 | 49.942 |
| 0.7560416666666666 | 49.942 |
| 0.7560532407407408 | 49.941 |
| 0.7560648148148149 | 49.942 |
| 0.7560763888888888 | 49.943 |
| 0.756087962962963 | 49.945 |
| 0.756099537037037 | 49.946 |
| 0.7561111111111112 | 49.947 |
| 0.7561226851851851 | 49.949 |
| 0.7561342592592593 | 49.949 |
| 0.7561458333333334 | 49.949 |
| 0.7561574074074073 | 49.949 |
| 0.7561689814814815 | 49.947 |
| 0.7561805555555555 | 49.944 |
| 0.7561921296296297 | 49.943 |
| 0.7562037037037036 | 49.943 |
| 0.7562152777777778 | 49.94 |
| 0.7562268518518519 | 49.938 |
| 0.7562384259259259 | 49.936 |
| 0.75625 | 49.936 |
| 0.756261574074074 | 49.938 |
| 0.7562731481481482 | 49.94 |
| 0.7562847222222223 | 49.94 |
| 0.7562962962962962 | 49.943 |
| 0.7563078703703704 | 49.947 |
| 0.7563194444444444 | 49.951 |
| 0.7563310185185186 | 49.956 |
| 0.7563425925925925 | 49.959 |
| 0.7563541666666667 | 49.961 |
| 0.7563657407407408 | 49.963 |
| 0.7563773148148148 | 49.963 |
| 0.7563888888888889 | 49.964 |
| 0.7564004629629629 | 49.963 |
| 0.7564120370370371 | 49.965 |
| 0.756423611111111 | 49.967 |
| 0.7564351851851852 | 49.967 |
| 0.7564467592592593 | 49.968 |
| 0.7564583333333333 | 49.968 |
| 0.7564699074074074 | 49.969 |
| 0.7564814814814814 | 49.967 |
| 0.7564930555555556 | 49.967 |
| 0.7565046296296297 | 49.966 |
| 0.7565162037037036 | 49.964 |
| 0.7565277777777778 | 49.964 |
| 0.7565393518518518 | 49.966 |
| 0.756550925925926 | 49.968 |
| 0.7565624999999999 | 49.971 |
| 0.7565740740740741 | 49.971 |
| 0.7565856481481482 | 49.972 |
| 0.7565972222222223 | 49.972 |
| 0.7566087962962963 | 49.972 |
| 0.7566203703703703 | 49.971 |
| 0.7566319444444445 | 49.97 |
| 0.7566435185185184 | 49.969 |
| 0.7566550925925926 | 49.969 |
| 0.7566666666666667 | 49.97 |
| 0.7566782407407407 | 49.969 |
| 0.7566898148148148 | 49.97 |
| 0.7567013888888888 | 49.971 |
| 0.756712962962963 | 49.972 |
| 0.7567245370370371 | 49.972 |
| 0.756736111111111 | 49.971 |
| 0.7567476851851852 | 49.973 |
| 0.7567592592592592 | 49.976 |
| 0.7567708333333334 | 49.98 |
| 0.7567824074074073 | 49.982 |
| 0.7567939814814815 | 49.983 |
| 0.7568055555555556 | 49.983 |
| 0.7568171296296297 | 49.985 |
| 0.7568287037037037 | 49.986 |
| 0.7568402777777777 | 49.985 |
| 0.7568518518518519 | 49.986 |
| 0.756863425925926 | 49.986 |
| 0.756875 | 49.989 |
| 0.7568865740740741 | 49.988 |
| 0.7568981481481482 | 49.988 |
| 0.7569097222222222 | 49.988 |
| 0.7569212962962962 | 49.986 |
| 0.7569328703703704 | 49.987 |
| 0.7569444444444445 | 49.986 |
| 0.7569560185185185 | 49.983 |
| 0.7569675925925926 | 49.98 |
| 0.7569791666666666 | 49.977 |
| 0.7569907407407408 | 49.975 |
| 0.7570023148148147 | 49.972 |
| 0.7570138888888889 | 49.97 |
| 0.757025462962963 | 49.968 |
| 0.7570370370370371 | 49.966 |
| 0.7570486111111111 | 49.967 |
| 0.7570601851851851 | 49.965 |
| 0.7570717592592593 | 49.967 |
| 0.7570833333333334 | 49.972 |
| 0.7570949074074074 | 49.979 |
| 0.7571064814814815 | 49.986 |
| 0.7571180555555556 | 49.991 |
| 0.7571296296296296 | 49.999 |
| 0.7571412037037036 | 50.007 |
| 0.7571527777777778 | 50.013 |
| 0.7571643518518519 | 50.022 |
| 0.7571759259259259 | 50.027 |
| 0.7571875 | 50.031 |
| 0.757199074074074 | 50.032 |
| 0.7572106481481482 | 50.033 |
| 0.7572222222222221 | 50.032 |
| 0.7572337962962963 | 50.03 |
| 0.7572453703703704 | 50.028 |
| 0.7572569444444445 | 50.029 |
| 0.7572685185185185 | 50.028 |
| 0.7572800925925925 | 50.028 |
| 0.7572916666666667 | 50.026 |
| 0.7573032407407408 | 50.025 |
| 0.7573148148148148 | 50.025 |
| 0.7573263888888889 | 50.027 |
| 0.757337962962963 | 50.027 |
| 0.757349537037037 | 50.029 |
| 0.757361111111111 | 50.029 |
| 0.7573726851851852 | 50.031 |
| 0.7573842592592593 | 50.032 |
| 0.7573958333333333 | 50.033 |
| 0.7574074074074074 | 50.034 |
| 0.7574189814814815 | 50.034 |
| 0.7574305555555556 | 50.034 |
| 0.7574421296296295 | 50.034 |
| 0.7574537037037037 | 50.035 |
| 0.7574652777777778 | 50.034 |
| 0.7574768518518519 | 50.035 |
| 0.7574884259259259 | 50.035 |
| 0.7575 | 50.037 |
| 0.7575115740740741 | 50.039 |
| 0.7575231481481483 | 50.042 |
| 0.7575347222222222 | 50.045 |
| 0.7575462962962963 | 50.046 |
| 0.7575578703703704 | 50.049 |
| 0.7575694444444445 | 50.05 |
| 0.7575810185185184 | 50.051 |
| 0.7575925925925926 | 50.051 |
| 0.7576041666666667 | 50.052 |
| 0.7576157407407407 | 50.051 |
| 0.7576273148148148 | 50.05 |
| 0.7576388888888889 | 50.05 |
| 0.757650462962963 | 50.05 |
| 0.7576620370370369 | 50.048 |
| 0.7576736111111111 | 50.048 |
| 0.7576851851851852 | 50.045 |
| 0.7576967592592593 | 50.044 |
| 0.7577083333333333 | 50.043 |
| 0.7577199074074074 | 50.042 |
| 0.7577314814814815 | 50.04 |
| 0.7577430555555557 | 50.038 |
| 0.7577546296296296 | 50.036 |
| 0.7577662037037037 | 50.035 |
| 0.7577777777777778 | 50.035 |
| 0.7577893518518519 | 50.033 |
| 0.7578009259259259 | 50.032 |
| 0.7578125 | 50.032 |
| 0.7578240740740741 | 50.031 |
| 0.7578356481481481 | 50.032 |
| 0.7578472222222222 | 50.033 |
| 0.7578587962962963 | 50.034 |
| 0.7578703703703704 | 50.038 |
| 0.7578819444444443 | 50.038 |
| 0.7578935185185185 | 50.038 |
| 0.7579050925925926 | 50.037 |
| 0.7579166666666667 | 50.039 |
| 0.7579282407407407 | 50.042 |
| 0.7579398148148148 | 50.044 |
| 0.7579513888888889 | 50.048 |
| 0.7579629629629631 | 50.051 |
| 0.757974537037037 | 50.052 |
| 0.7579861111111111 | 50.053 |
| 0.7579976851851852 | 50.052 |
| 0.7580092592592593 | 50.051 |
| 0.7580208333333333 | 50.048 |
| 0.7580324074074074 | 50.046 |
| 0.7580439814814816 | 50.043 |
| 0.7580555555555555 | 50.04 |
| 0.7580671296296296 | 50.037 |
| 0.7580787037037037 | 50.035 |
| 0.7580902777777778 | 50.035 |
| 0.7581018518518517 | 50.036 |
| 0.7581134259259259 | 50.037 |
| 0.758125 | 50.039 |
| 0.7581365740740741 | 50.04 |
| 0.7581481481481481 | 50.041 |
| 0.7581597222222222 | 50.04 |
| 0.7581712962962963 | 50.039 |
| 0.7581828703703705 | 50.039 |
| 0.7581944444444444 | 50.038 |
| 0.7582060185185185 | 50.038 |
| 0.7582175925925926 | 50.038 |
| 0.7582291666666667 | 50.037 |
| 0.7582407407407407 | 50.033 |
| 0.7582523148148148 | 50.03 |
| 0.758263888888889 | 50.029 |
| 0.758275462962963 | 50.028 |
| 0.758287037037037 | 50.029 |
| 0.7582986111111111 | 50.03 |
| 0.7583101851851852 | 50.031 |
| 0.7583217592592592 | 50.032 |
| 0.7583333333333333 | 50.033 |
| 0.7583449074074075 | 50.037 |
| 0.7583564814814815 | 50.04 |
| 0.7583680555555555 | 50.042 |
| 0.7583796296296296 | 50.044 |
| 0.7583912037037037 | 50.046 |
| 0.7584027777777779 | 50.046 |
| 0.7584143518518518 | 50.048 |
| 0.758425925925926 | 50.049 |
| 0.7584375 | 50.052 |
| 0.7584490740740741 | 50.053 |
| 0.7584606481481481 | 50.054 |
| 0.7584722222222222 | 50.054 |
| 0.7584837962962964 | 50.055 |
| 0.7584953703703704 | 50.054 |
| 0.7585069444444444 | 50.051 |
| 0.7585185185185185 | 50.049 |
| 0.7585300925925926 | 50.047 |
| 0.7585416666666666 | 50.045 |
| 0.7585532407407407 | 50.044 |
| 0.7585648148148149 | 50.045 |
| 0.7585763888888889 | 50.046 |
| 0.7585879629629629 | 50.046 |
| 0.758599537037037 | 50.047 |
| 0.7586111111111111 | 50.048 |
| 0.7586226851851853 | 50.047 |
| 0.7586342592592592 | 50.048 |
| 0.7586458333333334 | 50.05 |
| 0.7586574074074074 | 50.051 |
| 0.7586689814814815 | 50.05 |
| 0.7586805555555555 | 50.049 |
| 0.7586921296296296 | 50.049 |
| 0.7587037037037038 | 50.049 |
| 0.7587152777777778 | 50.047 |
| 0.7587268518518518 | 50.046 |
| 0.7587384259259259 | 50.044 |
| 0.75875 | 50.042 |
| 0.758761574074074 | 50.044 |
| 0.7587731481481481 | 50.043 |
| 0.7587847222222223 | 50.047 |
| 0.7587962962962963 | 50.047 |
| 0.7588078703703703 | 50.048 |
| 0.7588194444444444 | 50.05 |
| 0.7588310185185185 | 50.053 |
| 0.7588425925925927 | 50.054 |
| 0.7588541666666666 | 50.056 |
| 0.7588657407407408 | 50.059 |
| 0.7588773148148148 | 50.061 |
| 0.758888888888889 | 50.06 |
| 0.7589004629629629 | 50.06 |
| 0.758912037037037 | 50.058 |
| 0.7589236111111112 | 50.056 |
| 0.7589351851851852 | 50.052 |
| 0.7589467592592593 | 50.049 |
| 0.7589583333333333 | 50.046 |
| 0.7589699074074074 | 50.045 |
| 0.7589814814814816 | 50.045 |
| 0.7589930555555555 | 50.044 |
| 0.7590046296296297 | 50.043 |
| 0.7590162037037037 | 50.041 |
| 0.7590277777777777 | 50.041 |
| 0.7590393518518518 | 50.038 |
| 0.7590509259259259 | 50.034 |
| 0.7590625000000001 | 50.03 |
| 0.759074074074074 | 50.026 |
| 0.7590856481481482 | 50.026 |
| 0.7590972222222222 | 50.025 |
| 0.7591087962962964 | 50.025 |
| 0.7591203703703703 | 50.023 |
| 0.7591319444444444 | 50.024 |
| 0.7591435185185186 | 50.023 |
| 0.7591550925925926 | 50.024 |
| 0.7591666666666667 | 50.024 |
| 0.7591782407407407 | 50.024 |
| 0.7591898148148148 | 50.023 |
| 0.759201388888889 | 50.02 |
| 0.7592129629629629 | 50.017 |
| 0.7592245370370371 | 50.013 |
| 0.7592361111111111 | 50.012 |
| 0.7592476851851852 | 50.01 |
| 0.7592592592592592 | 50.01 |
| 0.7592708333333333 | 50.006 |
| 0.7592824074074075 | 50.004 |
| 0.7592939814814814 | 50.002 |
| 0.7593055555555556 | 50.002 |
| 0.7593171296296296 | 50.004 |
| 0.7593287037037038 | 50.007 |
| 0.7593402777777777 | 50.01 |
| 0.7593518518518518 | 50.012 |
| 0.759363425925926 | 50.016 |
| 0.759375 | 50.018 |
| 0.7593865740740741 | 50.02 |
| 0.7593981481481481 | 50.025 |
| 0.7594097222222222 | 50.027 |
| 0.7594212962962964 | 50.028 |
| 0.7594328703703703 | 50.031 |
| 0.7594444444444445 | 50.034 |
| 0.7594560185185185 | 50.038 |
| 0.7594675925925927 | 50.039 |
| 0.7594791666666666 | 50.042 |
| 0.7594907407407407 | 50.045 |
| 0.7595023148148149 | 50.048 |
| 0.7595138888888888 | 50.052 |
| 0.759525462962963 | 50.056 |
| 0.759537037037037 | 50.059 |
| 0.7595486111111112 | 50.058 |
| 0.7595601851851851 | 50.06 |
| 0.7595717592592592 | 50.062 |
| 0.7595833333333334 | 50.064 |
| 0.7595949074074074 | 50.063 |
| 0.7596064814814815 | 50.061 |
| 0.7596180555555555 | 50.061 |
| 0.7596296296296297 | 50.059 |
| 0.7596412037037038 | 50.057 |
| 0.7596527777777777 | 50.056 |
| 0.7596643518518519 | 50.055 |
| 0.7596759259259259 | 50.055 |
| 0.7596875000000001 | 50.055 |
| 0.759699074074074 | 50.055 |
| 0.7597106481481481 | 50.053 |
| 0.7597222222222223 | 50.052 |
| 0.7597337962962962 | 50.048 |
| 0.7597453703703704 | 50.046 |
| 0.7597569444444444 | 50.043 |
| 0.7597685185185186 | 50.039 |
| 0.7597800925925925 | 50.036 |
| 0.7597916666666666 | 50.035 |
| 0.7598032407407408 | 50.033 |
| 0.7598148148148148 | 50.03 |
| 0.7598263888888889 | 50.029 |
| 0.7598379629629629 | 50.026 |
| 0.7598495370370371 | 50.022 |
| 0.7598611111111112 | 50.019 |
| 0.7598726851851851 | 50.013 |
| 0.7598842592592593 | 50.009 |
| 0.7598958333333333 | 50.004 |
| 0.7599074074074075 | 50.001 |
| 0.7599189814814814 | 49.998 |
| 0.7599305555555556 | 49.997 |
| 0.7599421296296297 | 49.994 |
| 0.7599537037037036 | 49.995 |
| 0.7599652777777778 | 49.995 |
| 0.7599768518518518 | 49.996 |
| 0.759988425925926 | 49.996 |
| 0.7599999999999999 | 49.997 |
| 0.760011574074074 | 49.997 |
| 0.7600231481481482 | 49.998 |
| 0.7600347222222222 | 49.996 |
| 0.7600462962962963 | 49.995 |
| 0.7600578703703703 | 49.996 |
| 0.7600694444444445 | 49.998 |
| 0.7600810185185186 | 50 |
| 0.7600925925925925 | 50.005 |
| 0.7601041666666667 | 50.007 |
| 0.7601157407407407 | 50.011 |
| 0.7601273148148149 | 50.014 |
| 0.7601388888888888 | 50.017 |
| 0.760150462962963 | 50.023 |
| 0.7601620370370371 | 50.026 |
| 0.7601736111111111 | 50.032 |
| 0.7601851851851852 | 50.034 |
| 0.7601967592592592 | 50.037 |
| 0.7602083333333334 | 50.038 |
| 0.7602199074074073 | 50.038 |
| 0.7602314814814815 | 50.04 |
| 0.7602430555555556 | 50.038 |
| 0.7602546296296296 | 50.039 |
| 0.7602662037037037 | 50.039 |
| 0.7602777777777777 | 50.04 |
| 0.7602893518518519 | 50.042 |
| 0.760300925925926 | 50.043 |
| 0.7603125 | 50.045 |
| 0.7603240740740741 | 50.046 |
| 0.7603356481481481 | 50.046 |
| 0.7603472222222223 | 50.046 |
| 0.7603587962962962 | 50.043 |
| 0.7603703703703704 | 50.041 |
| 0.7603819444444445 | 50.037 |
| 0.7603935185185186 | 50.035 |
| 0.7604050925925926 | 50.032 |
| 0.7604166666666666 | 50.03 |
| 0.7604282407407408 | 50.028 |
| 0.7604398148148147 | 50.026 |
| 0.7604513888888889 | 50.025 |
| 0.760462962962963 | 50.025 |
| 0.760474537037037 | 50.027 |
| 0.7604861111111111 | 50.03 |
| 0.7604976851851851 | 50.033 |
| 0.7605092592592593 | 50.036 |
| 0.7605208333333334 | 50.04 |
| 0.7605324074074074 | 50.042 |
| 0.7605439814814815 | 50.044 |
| 0.7605555555555555 | 50.046 |
| 0.7605671296296297 | 50.047 |
| 0.7605787037037036 | 50.049 |
| 0.7605902777777778 | 50.049 |
| 0.7606018518518519 | 50.05 |
| 0.760613425925926 | 50.052 |
| 0.760625 | 50.055 |
| 0.760636574074074 | 50.053 |
| 0.7606481481481482 | 50.053 |
| 0.7606597222222221 | 50.051 |
| 0.7606712962962963 | 50.052 |
| 0.7606828703703704 | 50.051 |
| 0.7606944444444445 | 50.051 |
| 0.7607060185185185 | 50.05 |
| 0.7607175925925925 | 50.05 |
| 0.7607291666666667 | 50.049 |
| 0.7607407407407408 | 50.05 |
| 0.7607523148148148 | 50.051 |
| 0.7607638888888889 | 50.053 |
| 0.760775462962963 | 50.053 |
| 0.7607870370370371 | 50.055 |
| 0.760798611111111 | 50.055 |
| 0.7608101851851852 | 50.055 |
| 0.7608217592592593 | 50.056 |
| 0.7608333333333334 | 50.056 |
| 0.7608449074074074 | 50.057 |
| 0.7608564814814814 | 50.057 |
| 0.7608680555555556 | 50.057 |
| 0.7608796296296297 | 50.058 |
| 0.7608912037037037 | 50.059 |
| 0.7609027777777778 | 50.061 |
| 0.7609143518518519 | 50.06 |
| 0.7609259259259259 | 50.062 |
| 0.7609374999999999 | 50.064 |
| 0.7609490740740741 | 50.064 |
| 0.7609606481481482 | 50.065 |
| 0.7609722222222222 | 50.064 |
| 0.7609837962962963 | 50.061 |
| 0.7609953703703703 | 50.06 |
| 0.7610069444444445 | 50.059 |
| 0.7610185185185184 | 50.058 |
| 0.7610300925925926 | 50.057 |
| 0.7610416666666667 | 50.057 |
| 0.7610532407407408 | 50.058 |
| 0.7610648148148148 | 50.06 |
| 0.7610763888888888 | 50.061 |
| 0.761087962962963 | 50.063 |
| 0.7610995370370371 | 50.064 |
| 0.7611111111111111 | 50.062 |
| 0.7611226851851852 | 50.061 |
| 0.7611342592592593 | 50.059 |
| 0.7611458333333333 | 50.054 |
| 0.7611574074074073 | 50.053 |
| 0.7611689814814815 | 50.05 |
| 0.7611805555555556 | 50.05 |
| 0.7611921296296296 | 50.051 |
| 0.7612037037037037 | 50.051 |
| 0.7612152777777778 | 50.049 |
| 0.7612268518518519 | 50.048 |
| 0.7612384259259258 | 50.048 |
| 0.76125 | 50.047 |
| 0.7612615740740741 | 50.047 |
| 0.7612731481481482 | 50.047 |
| 0.7612847222222222 | 50.048 |
| 0.7612962962962962 | 50.048 |
| 0.7613078703703704 | 50.049 |
| 0.7613194444444445 | 50.048 |
| 0.7613310185185185 | 50.049 |
| 0.7613425925925926 | 50.048 |
| 0.7613541666666667 | 50.047 |
| 0.7613657407407407 | 50.048 |
| 0.7613773148148147 | 50.048 |
| 0.7613888888888889 | 50.048 |
| 0.761400462962963 | 50.047 |
| 0.761412037037037 | 50.046 |
| 0.7614236111111111 | 50.044 |
| 0.7614351851851852 | 50.043 |
| 0.7614467592592593 | 50.041 |
| 0.7614583333333332 | 50.038 |
| 0.7614699074074074 | 50.035 |
| 0.7614814814814815 | 50.032 |
| 0.7614930555555556 | 50.027 |
| 0.7615046296296296 | 50.025 |
| 0.7615162037037037 | 50.023 |
| 0.7615277777777778 | 50.021 |
| 0.761539351851852 | 50.019 |
| 0.7615509259259259 | 50.014 |
| 0.7615625 | 50.011 |
| 0.7615740740740741 | 50.007 |
| 0.7615856481481482 | 50.004 |
| 0.7615972222222221 | 50.003 |
| 0.7616087962962963 | 50.002 |
| 0.7616203703703704 | 50.001 |
| 0.7616319444444444 | 50.002 |
| 0.7616435185185185 | 50.005 |
| 0.7616550925925926 | 50.008 |
| 0.7616666666666667 | 50.01 |
| 0.7616782407407406 | 50.013 |
| 0.7616898148148148 | 50.015 |
| 0.7617013888888889 | 50.015 |
| 0.761712962962963 | 50.017 |
| 0.761724537037037 | 50.016 |
| 0.7617361111111111 | 50.018 |
| 0.7617476851851852 | 50.018 |
| 0.7617592592592594 | 50.019 |
| 0.7617708333333333 | 50.019 |
| 0.7617824074074074 | 50.021 |
| 0.7617939814814815 | 50.02 |
| 0.7618055555555556 | 50.02 |
| 0.7618171296296296 | 50.019 |
| 0.7618287037037037 | 50.019 |
| 0.7618402777777779 | 50.021 |
| 0.7618518518518518 | 50.021 |
| 0.7618634259259259 | 50.021 |
| 0.761875 | 50.019 |
| 0.7618865740740741 | 50.019 |
| 0.761898148148148 | 50.018 |
| 0.7619097222222222 | 50.018 |
| 0.7619212962962963 | 50.016 |
| 0.7619328703703704 | 50.015 |
| 0.7619444444444444 | 50.014 |
| 0.7619560185185185 | 50.014 |
| 0.7619675925925926 | 50.014 |
| 0.7619791666666668 | 50.016 |
| 0.7619907407407407 | 50.016 |
| 0.7620023148148148 | 50.015 |
| 0.7620138888888889 | 50.016 |
| 0.762025462962963 | 50.016 |
| 0.762037037037037 | 50.016 |
| 0.7620486111111111 | 50.017 |
| 0.7620601851851853 | 50.016 |
| 0.7620717592592593 | 50.017 |
| 0.7620833333333333 | 50.016 |
| 0.7620949074074074 | 50.014 |
| 0.7621064814814815 | 50.012 |
| 0.7621180555555555 | 50.011 |
| 0.7621296296296296 | 50.009 |
| 0.7621412037037038 | 50.008 |
| 0.7621527777777778 | 50.006 |
| 0.7621643518518518 | 50.004 |
| 0.7621759259259259 | 50 |
| 0.7621875 | 49.998 |
| 0.7621990740740742 | 49.994 |
| 0.7622106481481481 | 49.99 |
| 0.7622222222222222 | 49.988 |
| 0.7622337962962963 | 49.987 |
| 0.7622453703703704 | 49.988 |
| 0.7622569444444444 | 49.984 |
| 0.7622685185185185 | 49.986 |
| 0.7622800925925927 | 49.987 |
| 0.7622916666666667 | 49.987 |
| 0.7623032407407407 | 49.987 |
| 0.7623148148148148 | 49.988 |
| 0.7623263888888889 | 49.988 |
| 0.7623379629629629 | 49.988 |
| 0.762349537037037 | 49.986 |
| 0.7623611111111112 | 49.984 |
| 0.7623726851851852 | 49.983 |
| 0.7623842592592592 | 49.984 |
| 0.7623958333333333 | 49.983 |
| 0.7624074074074074 | 49.984 |
| 0.7624189814814816 | 49.984 |
| 0.7624305555555555 | 49.987 |
| 0.7624421296296297 | 49.987 |
| 0.7624537037037037 | 49.988 |
| 0.7624652777777778 | 49.992 |
| 0.7624768518518518 | 49.995 |
| 0.7624884259259259 | 49.998 |